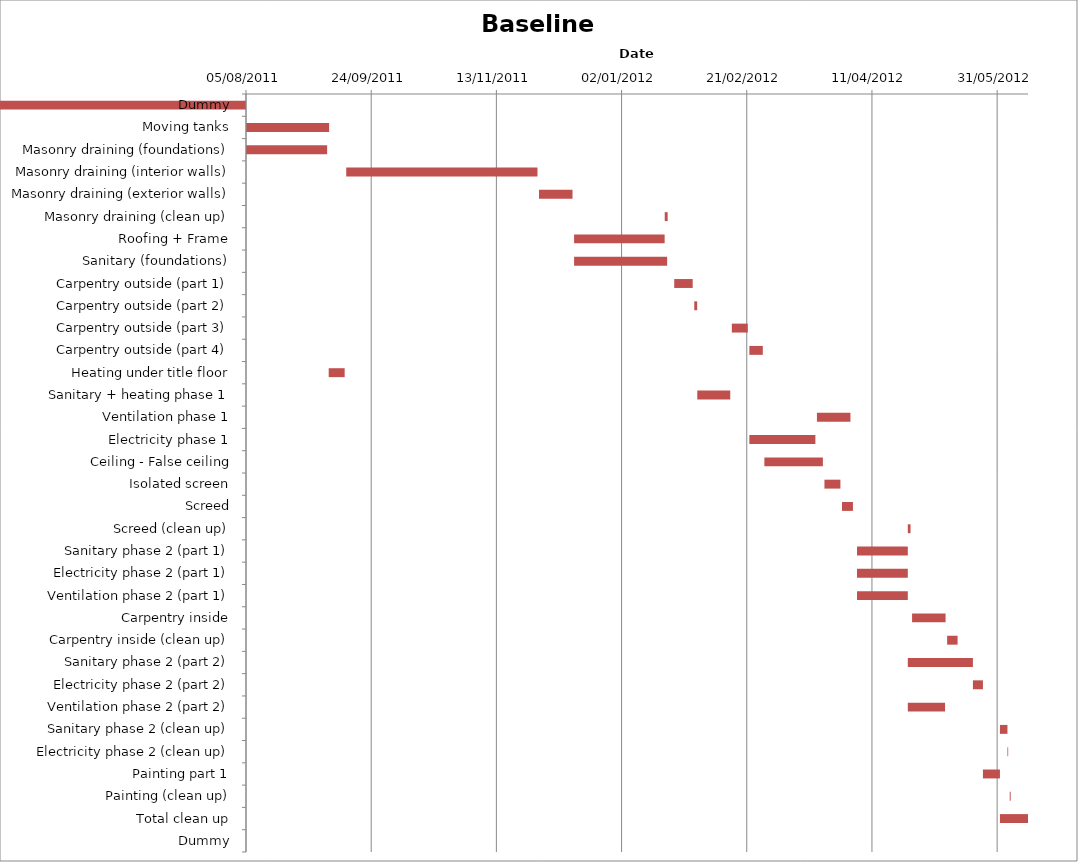
| Category | Baseline start | Actual duration |
|---|---|---|
| Dummy | 40760.333 | -0.625 |
| Moving tanks | 40760.333 | 33.167 |
| Masonry draining (foundations) | 40760.333 | 32.375 |
| Masonry draining (interior walls) | 40800.333 | 76.375 |
| Masonry draining (exterior walls) | 40877.333 | 13.375 |
| Masonry draining (clean up) | 40927.542 | 1.167 |
| Roofing + Frame | 40891.333 | 36.167 |
| Sanitary (foundations) | 40891.333 | 37.167 |
| Carpentry outside (part 1) | 40931.333 | 7.375 |
| Carpentry outside (part 2) | 40939.333 | 1.167 |
| Carpentry outside (part 3) | 40954.333 | 6.375 |
| Carpentry outside (part 4) | 40961.333 | 5.375 |
| Heating under title floor | 40793.333 | 6.375 |
| Sanitary + heating phase 1 | 40940.542 | 13.167 |
| Ventilation phase 1 | 40988.333 | 13.375 |
| Electricity phase 1 | 40961.333 | 26.375 |
| Ceiling - False ceiling | 40967.333 | 23.375 |
| Isolated screen | 40991.333 | 6.375 |
| Screed | 40998.333 | 4.375 |
| Screed (clean up) | 41024.625 | 1.083 |
| Sanitary phase 2 (part 1) | 41004.333 | 20.292 |
| Electricity phase 2 (part 1) | 41004.333 | 20.292 |
| Ventilation phase 2 (part 1) | 41004.333 | 20.292 |
| Carpentry inside | 41026.333 | 13.375 |
| Carpentry inside (clean up) | 41040.333 | 4.167 |
| Sanitary phase 2 (part 2) | 41024.625 | 26 |
| Electricity phase 2 (part 2) | 41050.625 | 4 |
| Ventilation phase 2 (part 2) | 41024.625 | 14.875 |
| Sanitary phase 2 (clean up) | 41061.417 | 3 |
| Electricity phase 2 (clean up) | 41064.417 | 0.292 |
| Painting part 1 | 41054.625 | 6.792 |
| Painting (clean up) | 41065.333 | 0.375 |
| Total clean up | 41061.417 | 11.208 |
| Dummy | 41072.625 | 0 |